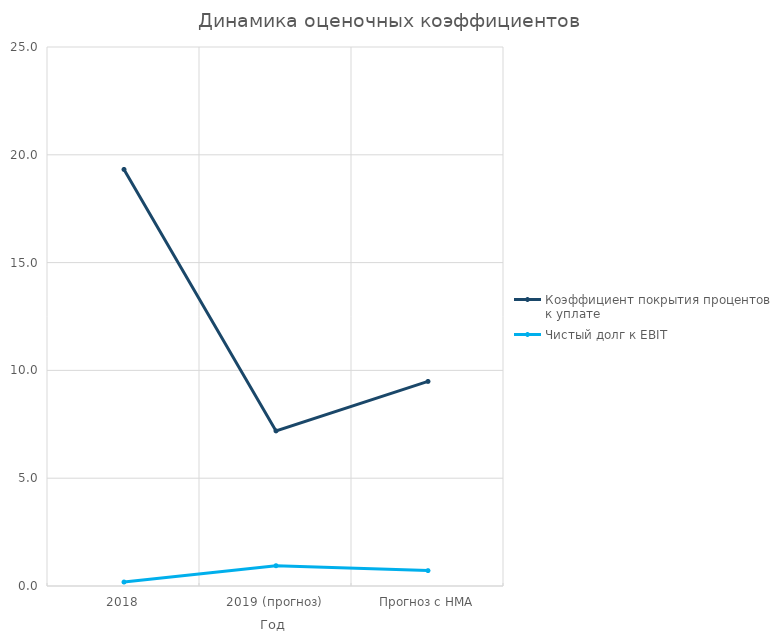
| Category | Коэффициент покрытия процентов к уплате | Чистый долг к EBIT |
|---|---|---|
| 2018 | 19.321 | 0.183 |
| 2019 (прогноз) | 7.194 | 0.941 |
| Прогноз с НМА | 9.488 | 0.714 |